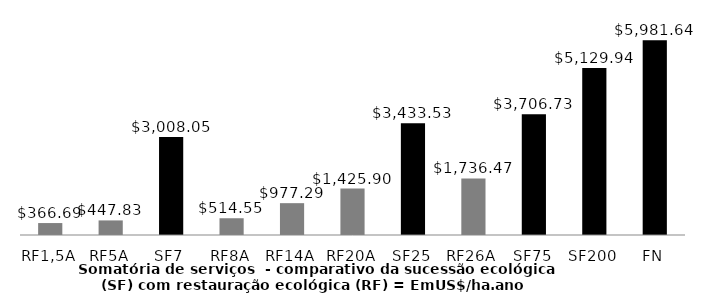
| Category | Series 0 |
|---|---|
| RF1,5A | 366.69 |
| RF5A | 447.831 |
| SF7 | 3008.05 |
| RF8A | 514.551 |
| RF14A | 977.287 |
| RF20A | 1425.903 |
| SF25 | 3433.53 |
| RF26A | 1736.475 |
| SF75 | 3706.73 |
| SF200 | 5129.94 |
| FN | 5981.644 |